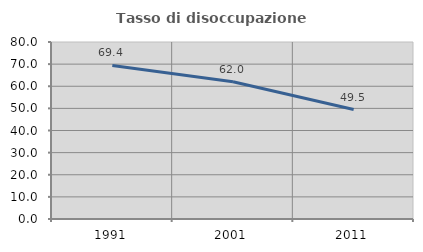
| Category | Tasso di disoccupazione giovanile  |
|---|---|
| 1991.0 | 69.388 |
| 2001.0 | 62 |
| 2011.0 | 49.468 |